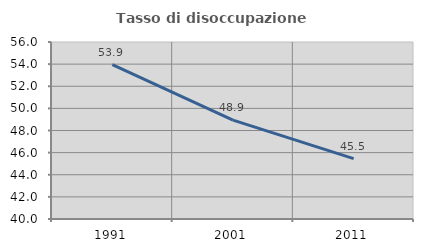
| Category | Tasso di disoccupazione giovanile  |
|---|---|
| 1991.0 | 53.947 |
| 2001.0 | 48.936 |
| 2011.0 | 45.455 |